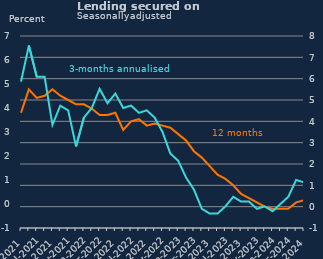
| Category | 12-month |
|---|---|
| May-2021 | 4.4 |
| Jun-2021 | 5.5 |
| Jul-2021 | 5.1 |
| Aug-2021 | 5.2 |
| Sep-2021 | 5.5 |
| Oct-2021 | 5.2 |
| Nov-2021 | 5 |
| Dec-2021 | 4.8 |
| Jan-2022 | 4.8 |
| Feb-2022 | 4.6 |
| Mar-2022 | 4.3 |
| Apr-2022 | 4.3 |
| May-2022 | 4.4 |
| Jun-2022 | 3.6 |
| Jul-2022 | 4 |
| Aug-2022 | 4.1 |
| Sep-2022 | 3.8 |
| Oct-2022 | 3.9 |
| Nov-2022 | 3.8 |
| Dec-2022 | 3.7 |
| Jan-2023 | 3.4 |
| Feb-2023 | 3.1 |
| Mar-2023 | 2.6 |
| Apr-2023 | 2.3 |
| May-2023 | 1.9 |
| Jun-2023 | 1.5 |
| Jul-2023 | 1.3 |
| Aug-2023 | 1 |
| Sep-2023 | 0.6 |
| Oct-2023 | 0.4 |
| Nov-2023 | 0.2 |
| Dec-2023 | 0 |
| Jan-2024 | -0.1 |
| Feb-2024 | -0.1 |
| Mar-2024 | -0.1 |
| Apr-2024 | 0.2 |
| May-2024 | 0.3 |